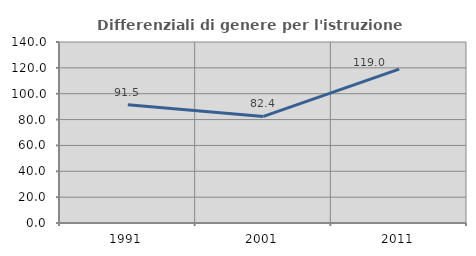
| Category | Differenziali di genere per l'istruzione superiore |
|---|---|
| 1991.0 | 91.532 |
| 2001.0 | 82.415 |
| 2011.0 | 119.028 |